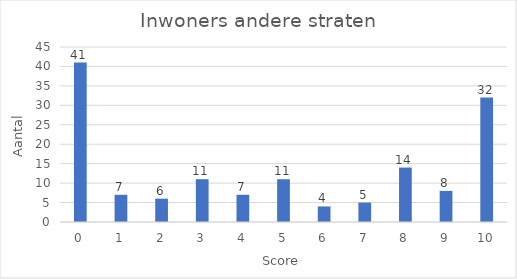
| Category | Series 0 |
|---|---|
| 0.0 | 41 |
| 1.0 | 7 |
| 2.0 | 6 |
| 3.0 | 11 |
| 4.0 | 7 |
| 5.0 | 11 |
| 6.0 | 4 |
| 7.0 | 5 |
| 8.0 | 14 |
| 9.0 | 8 |
| 10.0 | 32 |